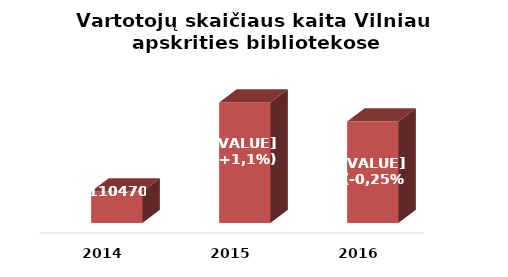
| Category | Series 0 |
|---|---|
| 2014.0 | 110470 |
| 2015.0 | 111801 |
| 2016.0 | 111518 |